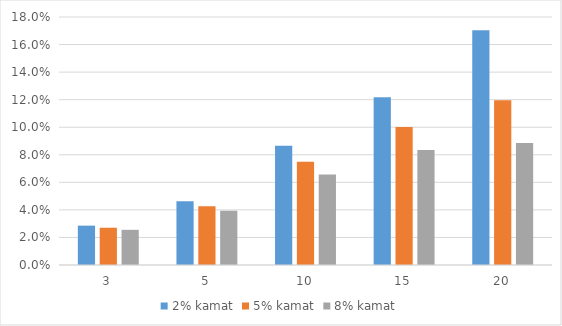
| Category | 2% kamat | 5% kamat | 8% kamat |
|---|---|---|---|
| 3.0 | 0.029 | 0.027 | 0.026 |
| 5.0 | 0.046 | 0.043 | 0.039 |
| 10.0 | 0.087 | 0.075 | 0.066 |
| 15.0 | 0.122 | 0.1 | 0.083 |
| 20.0 | 0.17 | 0.12 | 0.089 |